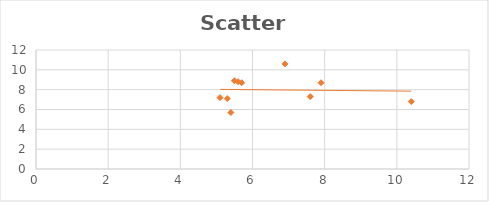
| Category | Series 0 |
|---|---|
| 7.6 | 7.3 |
| 5.1 | 7.2 |
| 10.4 | 6.8 |
| 6.9 | 10.6 |
| 5.6 | 8.8 |
| 7.9 | 8.7 |
| 5.4 | 5.7 |
| 5.7 | 8.7 |
| 5.5 | 8.9 |
| 5.3 | 7.1 |